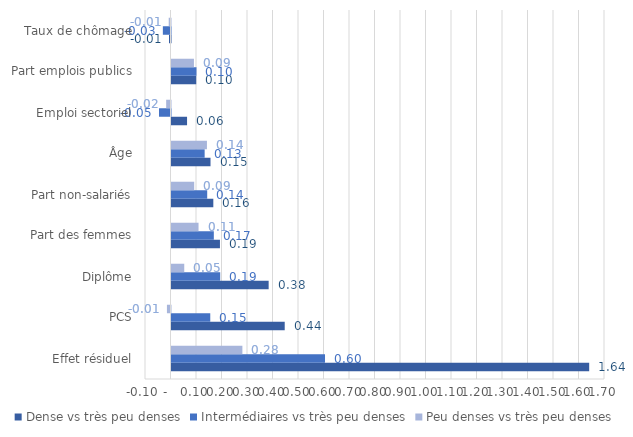
| Category | Dense vs très peu denses | Intermédiaires vs très peu denses | Peu denses vs très peu denses |
|---|---|---|---|
| Effet résiduel | 1.638 | 0.602 | 0.278 |
| PCS | 0.444 | 0.152 | -0.014 |
| Diplôme | 0.381 | 0.191 | 0.05 |
| Part des femmes | 0.19 | 0.166 | 0.106 |
| Part non-salariés | 0.164 | 0.14 | 0.089 |
| Âge | 0.153 | 0.13 | 0.139 |
| Emploi sectoriel | 0.061 | -0.045 | -0.017 |
| Part emplois publics | 0.097 | 0.098 | 0.088 |
| Taux de chômage | -0.006 | -0.03 | -0.007 |